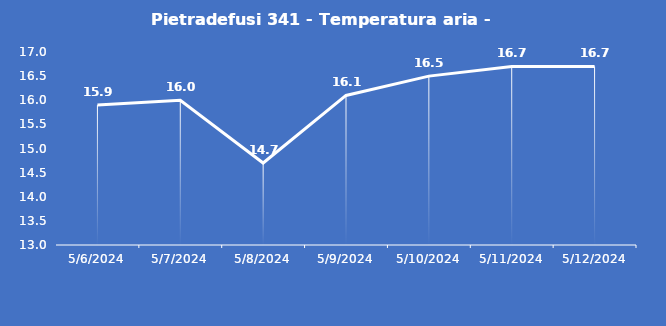
| Category | Pietradefusi 341 - Temperatura aria - Grezzo (°C) |
|---|---|
| 5/6/24 | 15.9 |
| 5/7/24 | 16 |
| 5/8/24 | 14.7 |
| 5/9/24 | 16.1 |
| 5/10/24 | 16.5 |
| 5/11/24 | 16.7 |
| 5/12/24 | 16.7 |